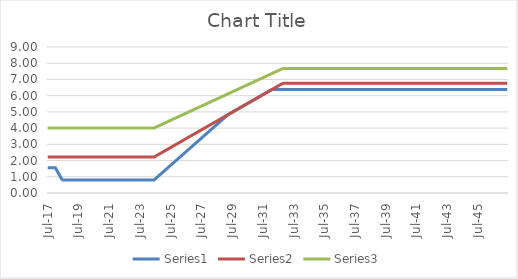
| Category | Series 0 | Series 1 | Series 2 |
|---|---|---|---|
| 2017-07-31 | 1.557 | 2.213 | 4.003 |
| 2017-08-31 | 1.557 | 2.213 | 4.003 |
| 2017-09-30 | 1.557 | 2.213 | 4.003 |
| 2017-10-31 | 1.557 | 2.213 | 4.003 |
| 2017-11-30 | 1.557 | 2.213 | 4.003 |
| 2017-12-31 | 1.557 | 2.213 | 4.003 |
| 2018-01-31 | 1.557 | 2.213 | 4.003 |
| 2018-02-28 | 1.417 | 2.213 | 4.003 |
| 2018-03-31 | 1.278 | 2.213 | 4.003 |
| 2018-04-30 | 1.139 | 2.213 | 4.003 |
| 2018-05-31 | 0.999 | 2.213 | 4.003 |
| 2018-06-30 | 0.86 | 2.213 | 4.003 |
| 2018-07-31 | 0.798 | 2.213 | 4.003 |
| 2018-08-31 | 0.798 | 2.213 | 4.003 |
| 2018-09-30 | 0.798 | 2.213 | 4.003 |
| 2018-10-31 | 0.798 | 2.213 | 4.003 |
| 2018-11-30 | 0.798 | 2.213 | 4.003 |
| 2018-12-31 | 0.798 | 2.213 | 4.003 |
| 2019-01-31 | 0.798 | 2.213 | 4.003 |
| 2019-02-28 | 0.798 | 2.213 | 4.003 |
| 2019-03-31 | 0.798 | 2.213 | 4.003 |
| 2019-04-30 | 0.798 | 2.213 | 4.003 |
| 2019-05-31 | 0.798 | 2.213 | 4.003 |
| 2019-06-30 | 0.798 | 2.213 | 4.003 |
| 2019-07-31 | 0.798 | 2.213 | 4.003 |
| 2019-08-31 | 0.798 | 2.213 | 4.003 |
| 2019-09-30 | 0.798 | 2.213 | 4.003 |
| 2019-10-31 | 0.798 | 2.213 | 4.003 |
| 2019-11-30 | 0.798 | 2.213 | 4.003 |
| 2019-12-31 | 0.798 | 2.213 | 4.003 |
| 2020-01-31 | 0.798 | 2.213 | 4.003 |
| 2020-02-29 | 0.798 | 2.213 | 4.003 |
| 2020-03-31 | 0.798 | 2.213 | 4.003 |
| 2020-04-30 | 0.798 | 2.213 | 4.003 |
| 2020-05-31 | 0.798 | 2.213 | 4.003 |
| 2020-06-30 | 0.798 | 2.213 | 4.003 |
| 2020-07-31 | 0.798 | 2.213 | 4.003 |
| 2020-08-31 | 0.798 | 2.213 | 4.003 |
| 2020-09-30 | 0.798 | 2.213 | 4.003 |
| 2020-10-31 | 0.798 | 2.213 | 4.003 |
| 2020-11-30 | 0.798 | 2.213 | 4.003 |
| 2020-12-31 | 0.798 | 2.213 | 4.003 |
| 2021-01-31 | 0.798 | 2.213 | 4.003 |
| 2021-02-28 | 0.798 | 2.213 | 4.003 |
| 2021-03-31 | 0.798 | 2.213 | 4.003 |
| 2021-04-30 | 0.798 | 2.213 | 4.003 |
| 2021-05-31 | 0.798 | 2.213 | 4.003 |
| 2021-06-30 | 0.798 | 2.213 | 4.003 |
| 2021-07-31 | 0.798 | 2.213 | 4.003 |
| 2021-08-31 | 0.798 | 2.213 | 4.003 |
| 2021-09-30 | 0.798 | 2.213 | 4.003 |
| 2021-10-31 | 0.798 | 2.213 | 4.003 |
| 2021-11-30 | 0.798 | 2.213 | 4.003 |
| 2021-12-31 | 0.798 | 2.213 | 4.003 |
| 2022-01-31 | 0.798 | 2.213 | 4.003 |
| 2022-02-28 | 0.798 | 2.213 | 4.003 |
| 2022-03-31 | 0.798 | 2.213 | 4.003 |
| 2022-04-30 | 0.798 | 2.213 | 4.003 |
| 2022-05-31 | 0.798 | 2.213 | 4.003 |
| 2022-06-30 | 0.798 | 2.213 | 4.003 |
| 2022-07-31 | 0.798 | 2.213 | 4.003 |
| 2022-08-31 | 0.798 | 2.213 | 4.003 |
| 2022-09-30 | 0.798 | 2.213 | 4.003 |
| 2022-10-31 | 0.798 | 2.213 | 4.003 |
| 2022-11-30 | 0.798 | 2.213 | 4.003 |
| 2022-12-31 | 0.798 | 2.213 | 4.003 |
| 2023-01-31 | 0.798 | 2.213 | 4.003 |
| 2023-02-28 | 0.798 | 2.213 | 4.003 |
| 2023-03-31 | 0.798 | 2.213 | 4.003 |
| 2023-04-30 | 0.798 | 2.213 | 4.003 |
| 2023-05-31 | 0.798 | 2.213 | 4.003 |
| 2023-06-30 | 0.798 | 2.213 | 4.003 |
| 2023-07-31 | 0.798 | 2.213 | 4.003 |
| 2023-08-31 | 0.798 | 2.213 | 4.003 |
| 2023-09-30 | 0.798 | 2.213 | 4.003 |
| 2023-10-31 | 0.798 | 2.213 | 4.003 |
| 2023-11-30 | 0.798 | 2.213 | 4.003 |
| 2023-12-31 | 0.798 | 2.213 | 4.003 |
| 2024-01-31 | 0.798 | 2.213 | 4.003 |
| 2024-02-29 | 0.798 | 2.213 | 4.003 |
| 2024-03-31 | 0.798 | 2.213 | 4.003 |
| 2024-04-30 | 0.798 | 2.213 | 4.003 |
| 2024-05-31 | 0.798 | 2.213 | 4.003 |
| 2024-06-30 | 0.798 | 2.213 | 4.003 |
| 2024-07-31 | 0.868 | 2.259 | 4.039 |
| 2024-08-31 | 0.938 | 2.304 | 4.076 |
| 2024-09-30 | 1.007 | 2.349 | 4.112 |
| 2024-10-31 | 1.077 | 2.394 | 4.149 |
| 2024-11-30 | 1.147 | 2.439 | 4.185 |
| 2024-12-31 | 1.216 | 2.485 | 4.222 |
| 2025-01-31 | 1.286 | 2.53 | 4.258 |
| 2025-02-28 | 1.356 | 2.575 | 4.295 |
| 2025-03-31 | 1.425 | 2.62 | 4.331 |
| 2025-04-30 | 1.495 | 2.666 | 4.367 |
| 2025-05-31 | 1.565 | 2.711 | 4.404 |
| 2025-06-30 | 1.634 | 2.756 | 4.44 |
| 2025-07-31 | 1.704 | 2.801 | 4.477 |
| 2025-08-31 | 1.774 | 2.846 | 4.513 |
| 2025-09-30 | 1.843 | 2.892 | 4.55 |
| 2025-10-31 | 1.913 | 2.937 | 4.586 |
| 2025-11-30 | 1.983 | 2.982 | 4.623 |
| 2025-12-31 | 2.052 | 3.027 | 4.659 |
| 2026-01-31 | 2.122 | 3.073 | 4.696 |
| 2026-02-28 | 2.192 | 3.118 | 4.732 |
| 2026-03-31 | 2.261 | 3.163 | 4.769 |
| 2026-04-30 | 2.331 | 3.208 | 4.805 |
| 2026-05-31 | 2.401 | 3.253 | 4.842 |
| 2026-06-30 | 2.47 | 3.299 | 4.878 |
| 2026-07-31 | 2.54 | 3.344 | 4.915 |
| 2026-08-31 | 2.61 | 3.389 | 4.951 |
| 2026-09-30 | 2.679 | 3.434 | 4.988 |
| 2026-10-31 | 2.749 | 3.48 | 5.024 |
| 2026-11-30 | 2.819 | 3.525 | 5.061 |
| 2026-12-31 | 2.888 | 3.57 | 5.097 |
| 2027-01-31 | 2.958 | 3.615 | 5.134 |
| 2027-02-28 | 3.028 | 3.66 | 5.17 |
| 2027-03-31 | 3.097 | 3.706 | 5.207 |
| 2027-04-30 | 3.167 | 3.751 | 5.243 |
| 2027-05-31 | 3.237 | 3.796 | 5.279 |
| 2027-06-30 | 3.306 | 3.841 | 5.316 |
| 2027-07-31 | 3.376 | 3.886 | 5.352 |
| 2027-08-31 | 3.446 | 3.932 | 5.389 |
| 2027-09-30 | 3.515 | 3.977 | 5.425 |
| 2027-10-31 | 3.585 | 4.022 | 5.462 |
| 2027-11-30 | 3.655 | 4.067 | 5.498 |
| 2027-12-31 | 3.724 | 4.113 | 5.535 |
| 2028-01-31 | 3.794 | 4.158 | 5.571 |
| 2028-02-29 | 3.864 | 4.203 | 5.608 |
| 2028-03-31 | 3.933 | 4.248 | 5.644 |
| 2028-04-30 | 4.003 | 4.293 | 5.681 |
| 2028-05-31 | 4.073 | 4.339 | 5.717 |
| 2028-06-30 | 4.142 | 4.384 | 5.754 |
| 2028-07-31 | 4.212 | 4.429 | 5.79 |
| 2028-08-31 | 4.282 | 4.474 | 5.827 |
| 2028-09-30 | 4.351 | 4.52 | 5.863 |
| 2028-10-31 | 4.421 | 4.565 | 5.9 |
| 2028-11-30 | 4.491 | 4.61 | 5.936 |
| 2028-12-31 | 4.56 | 4.655 | 5.973 |
| 2029-01-31 | 4.63 | 4.7 | 6.009 |
| 2029-02-28 | 4.7 | 4.746 | 6.046 |
| 2029-03-31 | 4.769 | 4.791 | 6.082 |
| 2029-04-30 | 4.836 | 4.836 | 6.119 |
| 2029-05-31 | 4.881 | 4.881 | 6.155 |
| 2029-06-30 | 4.927 | 4.927 | 6.191 |
| 2029-07-31 | 4.972 | 4.972 | 6.228 |
| 2029-08-31 | 5.017 | 5.017 | 6.264 |
| 2029-09-30 | 5.062 | 5.062 | 6.301 |
| 2029-10-31 | 5.107 | 5.107 | 6.337 |
| 2029-11-30 | 5.153 | 5.153 | 6.374 |
| 2029-12-31 | 5.198 | 5.198 | 6.41 |
| 2030-01-31 | 5.243 | 5.243 | 6.447 |
| 2030-02-28 | 5.288 | 5.288 | 6.483 |
| 2030-03-31 | 5.334 | 5.334 | 6.52 |
| 2030-04-30 | 5.379 | 5.379 | 6.556 |
| 2030-05-31 | 5.424 | 5.424 | 6.593 |
| 2030-06-30 | 5.469 | 5.469 | 6.629 |
| 2030-07-31 | 5.514 | 5.514 | 6.665 |
| 2030-08-31 | 5.56 | 5.56 | 6.702 |
| 2030-09-30 | 5.605 | 5.605 | 6.738 |
| 2030-10-31 | 5.65 | 5.65 | 6.775 |
| 2030-11-30 | 5.695 | 5.695 | 6.811 |
| 2030-12-31 | 5.741 | 5.741 | 6.848 |
| 2031-01-31 | 5.786 | 5.786 | 6.884 |
| 2031-02-28 | 5.831 | 5.831 | 6.921 |
| 2031-03-31 | 5.876 | 5.876 | 6.957 |
| 2031-04-30 | 5.921 | 5.921 | 6.994 |
| 2031-05-31 | 5.967 | 5.967 | 7.03 |
| 2031-06-30 | 6.012 | 6.012 | 7.067 |
| 2031-07-31 | 6.057 | 6.057 | 7.103 |
| 2031-08-31 | 6.102 | 6.102 | 7.139 |
| 2031-09-30 | 6.148 | 6.148 | 7.176 |
| 2031-10-31 | 6.193 | 6.193 | 7.212 |
| 2031-11-30 | 6.238 | 6.238 | 7.249 |
| 2031-12-31 | 6.283 | 6.283 | 7.285 |
| 2032-01-31 | 6.328 | 6.328 | 7.322 |
| 2032-02-29 | 6.374 | 6.374 | 7.358 |
| 2032-03-31 | 6.387 | 6.419 | 7.395 |
| 2032-04-30 | 6.387 | 6.464 | 7.431 |
| 2032-05-31 | 6.387 | 6.509 | 7.468 |
| 2032-06-30 | 6.387 | 6.555 | 7.504 |
| 2032-07-31 | 6.387 | 6.6 | 7.54 |
| 2032-08-31 | 6.387 | 6.645 | 7.577 |
| 2032-09-30 | 6.387 | 6.69 | 7.613 |
| 2032-10-31 | 6.387 | 6.735 | 7.65 |
| 2032-11-30 | 6.387 | 6.758 | 7.668 |
| 2032-12-31 | 6.387 | 6.758 | 7.668 |
| 2033-01-31 | 6.387 | 6.758 | 7.668 |
| 2033-02-28 | 6.387 | 6.758 | 7.668 |
| 2033-03-31 | 6.387 | 6.758 | 7.668 |
| 2033-04-30 | 6.387 | 6.758 | 7.668 |
| 2033-05-31 | 6.387 | 6.758 | 7.668 |
| 2033-06-30 | 6.387 | 6.758 | 7.668 |
| 2033-07-31 | 6.387 | 6.758 | 7.668 |
| 2033-08-31 | 6.387 | 6.758 | 7.668 |
| 2033-09-30 | 6.387 | 6.758 | 7.668 |
| 2033-10-31 | 6.387 | 6.758 | 7.668 |
| 2033-11-30 | 6.387 | 6.758 | 7.668 |
| 2033-12-31 | 6.387 | 6.758 | 7.668 |
| 2034-01-31 | 6.387 | 6.758 | 7.668 |
| 2034-02-28 | 6.387 | 6.758 | 7.668 |
| 2034-03-31 | 6.387 | 6.758 | 7.668 |
| 2034-04-30 | 6.387 | 6.758 | 7.668 |
| 2034-05-31 | 6.387 | 6.758 | 7.668 |
| 2034-06-30 | 6.387 | 6.758 | 7.668 |
| 2034-07-31 | 6.387 | 6.758 | 7.668 |
| 2034-08-31 | 6.387 | 6.758 | 7.668 |
| 2034-09-30 | 6.387 | 6.758 | 7.668 |
| 2034-10-31 | 6.387 | 6.758 | 7.668 |
| 2034-11-30 | 6.387 | 6.758 | 7.668 |
| 2034-12-31 | 6.387 | 6.758 | 7.668 |
| 2035-01-31 | 6.387 | 6.758 | 7.668 |
| 2035-02-28 | 6.387 | 6.758 | 7.668 |
| 2035-03-31 | 6.387 | 6.758 | 7.668 |
| 2035-04-30 | 6.387 | 6.758 | 7.668 |
| 2035-05-31 | 6.387 | 6.758 | 7.668 |
| 2035-06-30 | 6.387 | 6.758 | 7.668 |
| 2035-07-31 | 6.387 | 6.758 | 7.668 |
| 2035-08-31 | 6.387 | 6.758 | 7.668 |
| 2035-09-30 | 6.387 | 6.758 | 7.668 |
| 2035-10-31 | 6.387 | 6.758 | 7.668 |
| 2035-11-30 | 6.387 | 6.758 | 7.668 |
| 2035-12-31 | 6.387 | 6.758 | 7.668 |
| 2036-01-31 | 6.387 | 6.758 | 7.668 |
| 2036-02-29 | 6.387 | 6.758 | 7.668 |
| 2036-03-31 | 6.387 | 6.758 | 7.668 |
| 2036-04-30 | 6.387 | 6.758 | 7.668 |
| 2036-05-31 | 6.387 | 6.758 | 7.668 |
| 2036-06-30 | 6.387 | 6.758 | 7.668 |
| 2036-07-31 | 6.387 | 6.758 | 7.668 |
| 2036-08-31 | 6.387 | 6.758 | 7.668 |
| 2036-09-30 | 6.387 | 6.758 | 7.668 |
| 2036-10-31 | 6.387 | 6.758 | 7.668 |
| 2036-11-30 | 6.387 | 6.758 | 7.668 |
| 2036-12-31 | 6.387 | 6.758 | 7.668 |
| 2037-01-31 | 6.387 | 6.758 | 7.668 |
| 2037-02-28 | 6.387 | 6.758 | 7.668 |
| 2037-03-31 | 6.387 | 6.758 | 7.668 |
| 2037-04-30 | 6.387 | 6.758 | 7.668 |
| 2037-05-31 | 6.387 | 6.758 | 7.668 |
| 2037-06-30 | 6.387 | 6.758 | 7.668 |
| 2037-07-31 | 6.387 | 6.758 | 7.668 |
| 2037-08-31 | 6.387 | 6.758 | 7.668 |
| 2037-09-30 | 6.387 | 6.758 | 7.668 |
| 2037-10-31 | 6.387 | 6.758 | 7.668 |
| 2037-11-30 | 6.387 | 6.758 | 7.668 |
| 2037-12-31 | 6.387 | 6.758 | 7.668 |
| 2038-01-31 | 6.387 | 6.758 | 7.668 |
| 2038-02-28 | 6.387 | 6.758 | 7.668 |
| 2038-03-31 | 6.387 | 6.758 | 7.668 |
| 2038-04-30 | 6.387 | 6.758 | 7.668 |
| 2038-05-31 | 6.387 | 6.758 | 7.668 |
| 2038-06-30 | 6.387 | 6.758 | 7.668 |
| 2038-07-31 | 6.387 | 6.758 | 7.668 |
| 2038-08-31 | 6.387 | 6.758 | 7.668 |
| 2038-09-30 | 6.387 | 6.758 | 7.668 |
| 2038-10-31 | 6.387 | 6.758 | 7.668 |
| 2038-11-30 | 6.387 | 6.758 | 7.668 |
| 2038-12-31 | 6.387 | 6.758 | 7.668 |
| 2039-01-31 | 6.387 | 6.758 | 7.668 |
| 2039-02-28 | 6.387 | 6.758 | 7.668 |
| 2039-03-31 | 6.387 | 6.758 | 7.668 |
| 2039-04-30 | 6.387 | 6.758 | 7.668 |
| 2039-05-31 | 6.387 | 6.758 | 7.668 |
| 2039-06-30 | 6.387 | 6.758 | 7.668 |
| 2039-07-31 | 6.387 | 6.758 | 7.668 |
| 2039-08-31 | 6.387 | 6.758 | 7.668 |
| 2039-09-30 | 6.387 | 6.758 | 7.668 |
| 2039-10-31 | 6.387 | 6.758 | 7.668 |
| 2039-11-30 | 6.387 | 6.758 | 7.668 |
| 2039-12-31 | 6.387 | 6.758 | 7.668 |
| 2040-01-31 | 6.387 | 6.758 | 7.668 |
| 2040-02-29 | 6.387 | 6.758 | 7.668 |
| 2040-03-31 | 6.387 | 6.758 | 7.668 |
| 2040-04-30 | 6.387 | 6.758 | 7.668 |
| 2040-05-31 | 6.387 | 6.758 | 7.668 |
| 2040-06-30 | 6.387 | 6.758 | 7.668 |
| 2040-07-31 | 6.387 | 6.758 | 7.668 |
| 2040-08-31 | 6.387 | 6.758 | 7.668 |
| 2040-09-30 | 6.387 | 6.758 | 7.668 |
| 2040-10-31 | 6.387 | 6.758 | 7.668 |
| 2040-11-30 | 6.387 | 6.758 | 7.668 |
| 2040-12-31 | 6.387 | 6.758 | 7.668 |
| 2041-01-31 | 6.387 | 6.758 | 7.668 |
| 2041-02-28 | 6.387 | 6.758 | 7.668 |
| 2041-03-31 | 6.387 | 6.758 | 7.668 |
| 2041-04-30 | 6.387 | 6.758 | 7.668 |
| 2041-05-31 | 6.387 | 6.758 | 7.668 |
| 2041-06-30 | 6.387 | 6.758 | 7.668 |
| 2041-07-31 | 6.387 | 6.758 | 7.668 |
| 2041-08-31 | 6.387 | 6.758 | 7.668 |
| 2041-09-30 | 6.387 | 6.758 | 7.668 |
| 2041-10-31 | 6.387 | 6.758 | 7.668 |
| 2041-11-30 | 6.387 | 6.758 | 7.668 |
| 2041-12-31 | 6.387 | 6.758 | 7.668 |
| 2042-01-31 | 6.387 | 6.758 | 7.668 |
| 2042-02-28 | 6.387 | 6.758 | 7.668 |
| 2042-03-31 | 6.387 | 6.758 | 7.668 |
| 2042-04-30 | 6.387 | 6.758 | 7.668 |
| 2042-05-31 | 6.387 | 6.758 | 7.668 |
| 2042-06-30 | 6.387 | 6.758 | 7.668 |
| 2042-07-31 | 6.387 | 6.758 | 7.668 |
| 2042-08-31 | 6.387 | 6.758 | 7.668 |
| 2042-09-30 | 6.387 | 6.758 | 7.668 |
| 2042-10-31 | 6.387 | 6.758 | 7.668 |
| 2042-11-30 | 6.387 | 6.758 | 7.668 |
| 2042-12-31 | 6.387 | 6.758 | 7.668 |
| 2043-01-31 | 6.387 | 6.758 | 7.668 |
| 2043-02-28 | 6.387 | 6.758 | 7.668 |
| 2043-03-31 | 6.387 | 6.758 | 7.668 |
| 2043-04-30 | 6.387 | 6.758 | 7.668 |
| 2043-05-31 | 6.387 | 6.758 | 7.668 |
| 2043-06-30 | 6.387 | 6.758 | 7.668 |
| 2043-07-31 | 6.387 | 6.758 | 7.668 |
| 2043-08-31 | 6.387 | 6.758 | 7.668 |
| 2043-09-30 | 6.387 | 6.758 | 7.668 |
| 2043-10-31 | 6.387 | 6.758 | 7.668 |
| 2043-11-30 | 6.387 | 6.758 | 7.668 |
| 2043-12-31 | 6.387 | 6.758 | 7.668 |
| 2044-01-31 | 6.387 | 6.758 | 7.668 |
| 2044-02-29 | 6.387 | 6.758 | 7.668 |
| 2044-03-31 | 6.387 | 6.758 | 7.668 |
| 2044-04-30 | 6.387 | 6.758 | 7.668 |
| 2044-05-31 | 6.387 | 6.758 | 7.668 |
| 2044-06-30 | 6.387 | 6.758 | 7.668 |
| 2044-07-31 | 6.387 | 6.758 | 7.668 |
| 2044-08-31 | 6.387 | 6.758 | 7.668 |
| 2044-09-30 | 6.387 | 6.758 | 7.668 |
| 2044-10-31 | 6.387 | 6.758 | 7.668 |
| 2044-11-30 | 6.387 | 6.758 | 7.668 |
| 2044-12-31 | 6.387 | 6.758 | 7.668 |
| 2045-01-31 | 6.387 | 6.758 | 7.668 |
| 2045-02-28 | 6.387 | 6.758 | 7.668 |
| 2045-03-31 | 6.387 | 6.758 | 7.668 |
| 2045-04-30 | 6.387 | 6.758 | 7.668 |
| 2045-05-31 | 6.387 | 6.758 | 7.668 |
| 2045-06-30 | 6.387 | 6.758 | 7.668 |
| 2045-07-31 | 6.387 | 6.758 | 7.668 |
| 2045-08-31 | 6.387 | 6.758 | 7.668 |
| 2045-09-30 | 6.387 | 6.758 | 7.668 |
| 2045-10-31 | 6.387 | 6.758 | 7.668 |
| 2045-11-30 | 6.387 | 6.758 | 7.668 |
| 2045-12-31 | 6.387 | 6.758 | 7.668 |
| 2046-01-31 | 6.387 | 6.758 | 7.668 |
| 2046-02-28 | 6.387 | 6.758 | 7.668 |
| 2046-03-31 | 6.387 | 6.758 | 7.668 |
| 2046-04-30 | 6.387 | 6.758 | 7.668 |
| 2046-05-31 | 6.387 | 6.758 | 7.668 |
| 2046-06-30 | 6.387 | 6.758 | 7.668 |
| 2046-07-31 | 6.387 | 6.758 | 7.668 |
| 2046-08-31 | 6.387 | 6.758 | 7.668 |
| 2046-09-30 | 6.387 | 6.758 | 7.668 |
| 2046-10-31 | 6.387 | 6.758 | 7.668 |
| 2046-11-30 | 6.387 | 6.758 | 7.668 |
| 2046-12-31 | 6.387 | 6.758 | 7.668 |
| 2047-01-31 | 6.387 | 6.758 | 7.668 |
| 2047-02-28 | 6.387 | 6.758 | 7.668 |
| 2047-03-31 | 6.387 | 6.758 | 7.668 |
| 2047-04-30 | 6.387 | 6.758 | 7.668 |
| 2047-05-31 | 6.387 | 6.758 | 7.668 |
| 2047-06-30 | 6.387 | 6.758 | 7.668 |